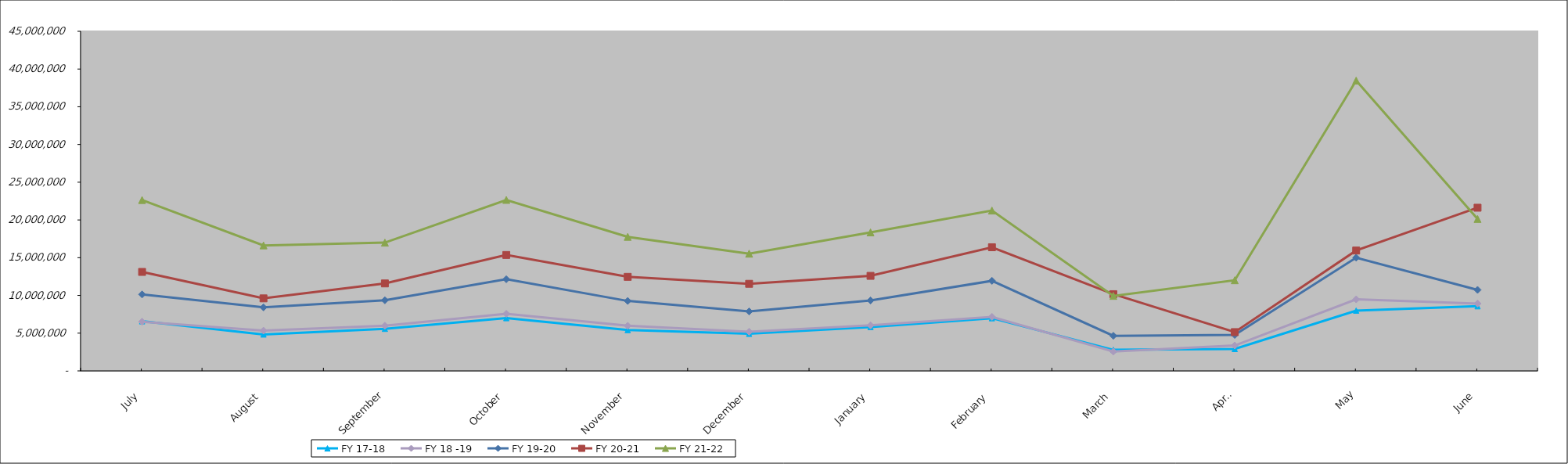
| Category | FY 06-07 | FY 07-08 | FY 17-18 | FY 18 -19 | FY 19-20 | FY 20-21 | FY 21-22 |
|---|---|---|---|---|---|---|---|
| July |  |  | 6572726.08 | 6515441.78 | 10129786.46 | 13114253.8 | 22642232.74 |
| August |  |  | 4827719.43 | 5335091.74 | 8415763.2 | 9609311.19 | 16627891.79 |
| September |  |  | 5579452.89 | 5990770.95 | 9354413.83 | 11589723.97 | 16993320.18 |
| October |  |  | 6986574.78 | 7560484.14 | 12143833.92 | 15361091.39 | 22657906.46 |
| November |  |  | 5412424.7 | 5976711.71 | 9269412.84 | 12461328.43 | 17763645.6 |
| December |  |  | 4913963.73 | 5192531.94 | 7878350.75 | 11537287.8 | 15532874.37 |
| January |  |  | 5813120.94 | 6037170.97 | 9336254.69 | 12591674.19 | 18349614 |
| February |  |  | 6982142.34 | 7158950.47 | 11934408.34 | 16384232.54 | 21244623.31 |
| March |  |  | 2789729.87 | 2563221.15 | 4649453.68 | 10166214.39 | 9938797.35 |
| April |  |  | 2902289.97 | 3365706.38 | 4763090.91 | 5138570.75 | 12011340.22 |
| May |  |  | 7987837.23 | 9478520.9 | 15004072.67 | 15948899.71 | 38467162.29 |
| June |  |  | 8568928.34 | 8919300.7 | 10733185.67 | 21622870.32 | 20131598.25 |